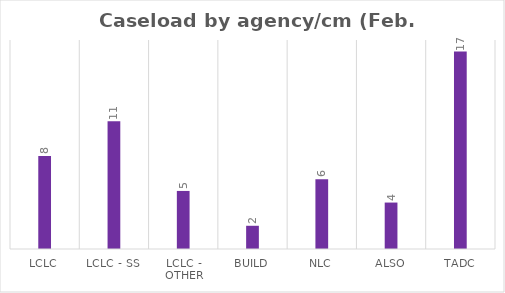
| Category | Series 0 |
|---|---|
| LCLC | 8 |
| LCLC - SS | 11 |
| LCLC - Other | 5 |
| BUILD | 2 |
| NLC | 6 |
| ALSO | 4 |
| TADC | 17 |